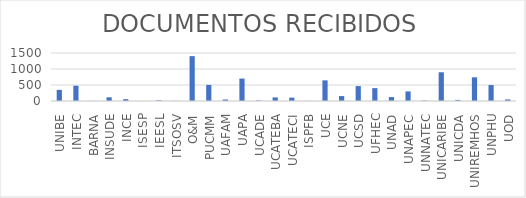
| Category | Series 0 |
|---|---|
| UNIBE | 348 |
| INTEC | 478 |
| BARNA | 3 |
| INSUDE | 116 |
| INCE | 57 |
| ISESP | 1 |
| IEESL | 22 |
| ITSOSV | 5 |
| O&M | 1402 |
| PUCMM | 504 |
| UAFAM | 47 |
| UAPA | 701 |
| UCADE | 17 |
| UCATEBA | 112 |
| UCATECI | 104 |
| ISPFB | 3 |
| UCE | 645 |
| UCNE | 154 |
| UCSD | 466 |
| UFHEC | 402 |
| UNAD | 123 |
| UNAPEC | 300 |
| UNNATEC | 13 |
| UNICARIBE | 898 |
| UNICDA | 34 |
| UNIREMHOS | 740 |
| UNPHU | 498 |
| UOD | 49 |